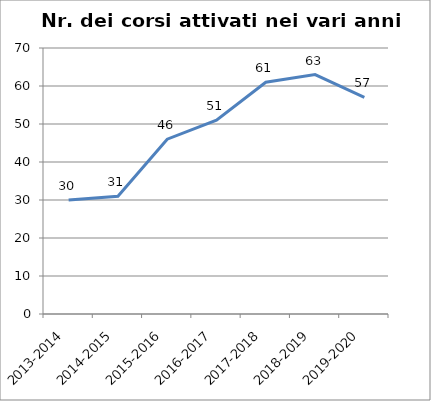
| Category | Nr. Corsi Attivati |
|---|---|
| 2013-2014 | 30 |
| 2014-2015 | 31 |
| 2015-2016 | 46 |
| 2016-2017 | 51 |
| 2017-2018 | 61 |
| 2018-2019 | 63 |
| 2019-2020 | 57 |